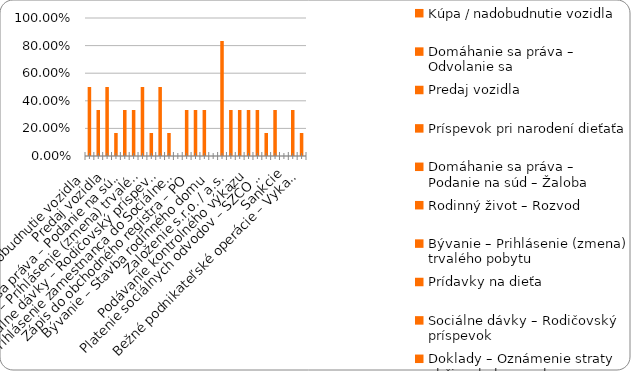
| Category | % |
|---|---|
| Kúpa / nadobudnutie vozidla | 0.5 |
| Domáhanie sa práva – Odvolanie sa | 0.333 |
| Predaj vozidla | 0.5 |
| Príspevok pri narodení dieťaťa | 0.167 |
| Domáhanie sa práva – Podanie na súd – Žaloba | 0.333 |
| Rodinný život – Rozvod | 0.333 |
| Bývanie – Prihlásenie (zmena) trvalého pobytu | 0.5 |
| Prídavky na dieťa | 0.167 |
| Sociálne dávky – Rodičovský príspevok | 0.5 |
| Doklady – Oznámenie straty občianskeho preukazu | 0.167 |
| Prihlásenie zamestnanca do Sociálnej poisťovne | 0 |
| Plnenie si daňových povinností – zamestnanec (FO) | 0.333 |
| Zápis do obchodného registra – PO | 0.333 |
| Živnosť - ukončenie | 0.333 |
| Bývanie – Stavba rodinného domu | 0 |
| Sociálne dávky – Príspevok v nezamestnanosti | 0.833 |
| Založenie s.r.o. / a.s. | 0.333 |
| Živnosť – založenie | 0.333 |
| Podávanie kontrolného výkazu | 0.333 |
| Plnenie si daňových povinností – SZČO / PO  | 0.333 |
| Platenie sociálnych odvodov – SZČO / PO | 0.167 |
| Živnosť - prerušenie | 0.333 |
| Sankcie | 0 |
| Živnosť - zmena | 0.333 |
| Bežné podnikateľské operácie – Vykazovanie štatistík | 0.167 |